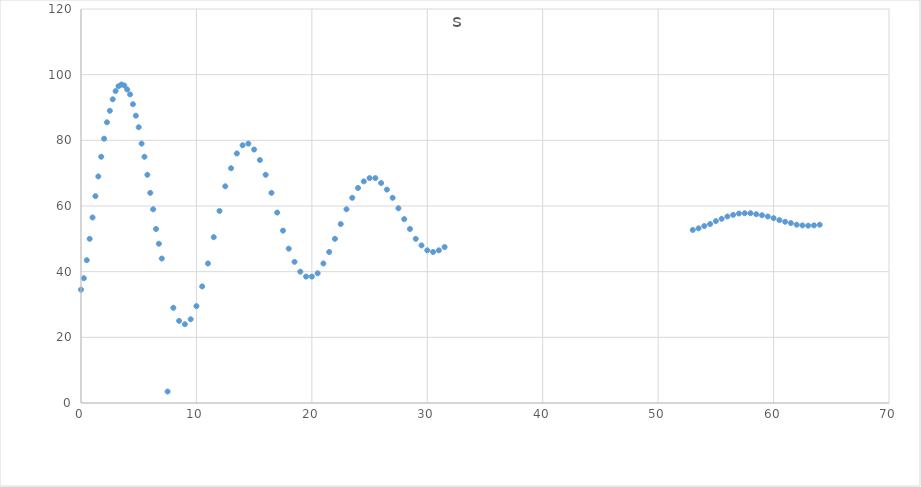
| Category | s |
|---|---|
| 0.0 | 34.5 |
| 0.25 | 38 |
| 0.5 | 43.5 |
| 0.75 | 50 |
| 1.0 | 56.5 |
| 1.25 | 63 |
| 1.5 | 69 |
| 1.75 | 75 |
| 2.0 | 80.5 |
| 2.25 | 85.5 |
| 2.5 | 89 |
| 2.75 | 92.5 |
| 3.0 | 95 |
| 3.25 | 96.5 |
| 3.5 | 97 |
| 3.75 | 96.7 |
| 4.0 | 95.5 |
| 4.25 | 94 |
| 4.5 | 91 |
| 4.75 | 87.5 |
| 5.0 | 84 |
| 5.25 | 79 |
| 5.5 | 75 |
| 5.75 | 69.5 |
| 6.0 | 64 |
| 6.25 | 59 |
| 6.5 | 53 |
| 6.75 | 48.5 |
| 7.0 | 44 |
| 7.5 | 3.5 |
| 8.0 | 29 |
| 8.5 | 25 |
| 9.0 | 24 |
| 9.5 | 25.5 |
| 10.0 | 29.5 |
| 10.5 | 35.5 |
| 11.0 | 42.5 |
| 11.5 | 50.5 |
| 12.0 | 58.5 |
| 12.5 | 66 |
| 13.0 | 71.5 |
| 13.5 | 76 |
| 14.0 | 78.5 |
| 14.5 | 79 |
| 15.0 | 77.2 |
| 15.5 | 74 |
| 16.0 | 69.5 |
| 16.5 | 64 |
| 17.0 | 58 |
| 17.5 | 52.5 |
| 18.0 | 47 |
| 18.5 | 43 |
| 19.0 | 40 |
| 19.5 | 38.5 |
| 20.0 | 38.5 |
| 20.5 | 39.5 |
| 21.0 | 42.5 |
| 21.5 | 46 |
| 22.0 | 50 |
| 22.5 | 54.5 |
| 23.0 | 59 |
| 23.5 | 62.5 |
| 24.0 | 65.5 |
| 24.5 | 67.5 |
| 25.0 | 68.5 |
| 25.5 | 68.5 |
| 26.0 | 67 |
| 26.5 | 65 |
| 27.0 | 62.5 |
| 27.5 | 59.3 |
| 28.0 | 56 |
| 28.5 | 53 |
| 29.0 | 50 |
| 29.5 | 48 |
| 30.0 | 46.5 |
| 30.5 | 46 |
| 31.0 | 46.5 |
| 31.5 | 47.5 |
| 53.0 | 52.7 |
| 53.5 | 53.2 |
| 54.0 | 53.9 |
| 54.5 | 54.5 |
| 55.0 | 55.4 |
| 55.5 | 56.1 |
| 56.0 | 56.8 |
| 56.5 | 57.3 |
| 57.0 | 57.7 |
| 57.5 | 57.8 |
| 58.0 | 57.8 |
| 58.5 | 57.5 |
| 59.0 | 57.2 |
| 59.5 | 56.8 |
| 60.0 | 56.3 |
| 60.5 | 55.7 |
| 61.0 | 55.2 |
| 61.5 | 54.8 |
| 62.0 | 54.3 |
| 62.5 | 54.1 |
| 63.0 | 54 |
| 63.5 | 54.1 |
| 64.0 | 54.3 |